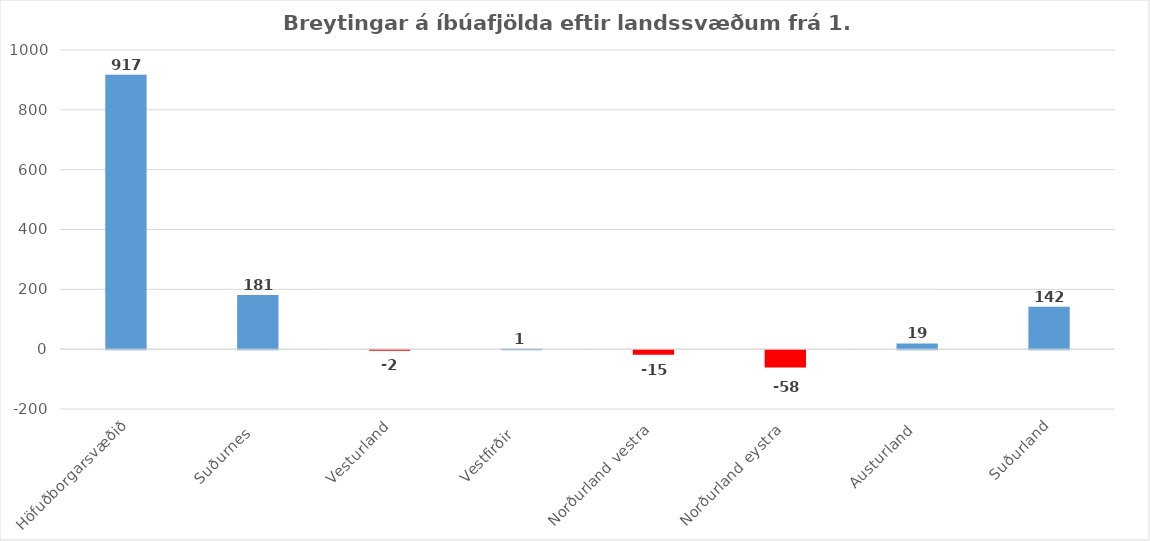
| Category | Series 0 |
|---|---|
| Höfuðborgarsvæðið | 917 |
| Suðurnes  | 181 |
| Vesturland | -2 |
| Vestfirðir  | 1 |
| Norðurland vestra | -15 |
| Norðurland eystra | -58 |
| Austurland | 19 |
| Suðurland | 142 |